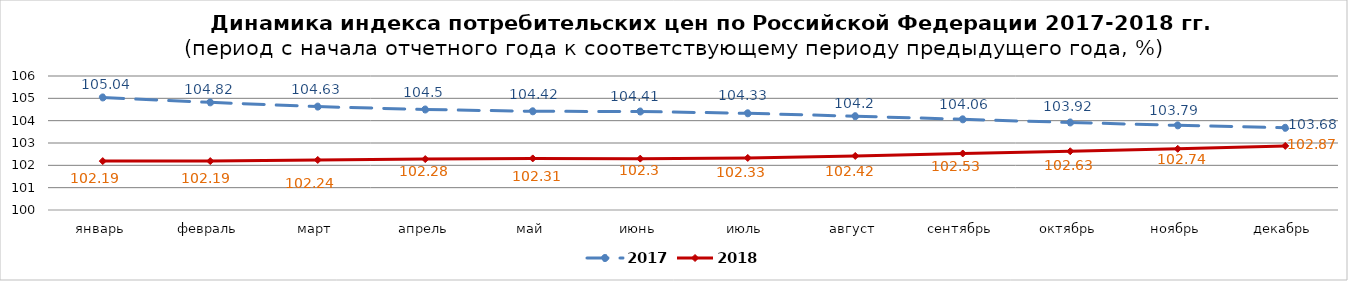
| Category | 2017 | 2018 |
|---|---|---|
| январь | 105.04 | 102.19 |
| февраль | 104.82 | 102.19 |
| март | 104.63 | 102.24 |
| апрель | 104.5 | 102.28 |
| май | 104.42 | 102.31 |
| июнь | 104.41 | 102.3 |
| июль | 104.33 | 102.33 |
| август | 104.2 | 102.42 |
| сентябрь | 104.06 | 102.53 |
| октябрь | 103.92 | 102.63 |
| ноябрь | 103.79 | 102.74 |
| декабрь | 103.68 | 102.87 |